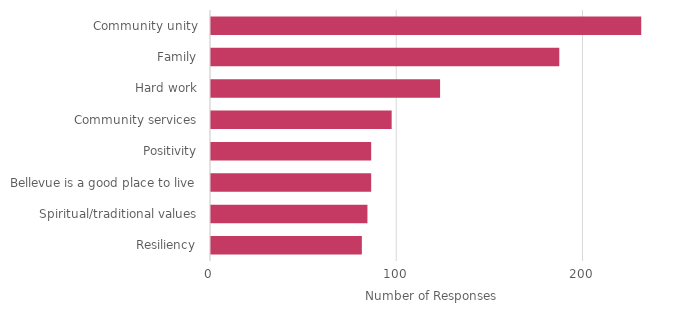
| Category | Series 0 |
|---|---|
| Resiliency | 81 |
| Spiritual/traditional values | 84 |
| Bellevue is a good place to live | 86 |
| Positivity | 86 |
| Community services | 97 |
| Hard work | 123 |
| Family | 187 |
| Community unity | 231 |